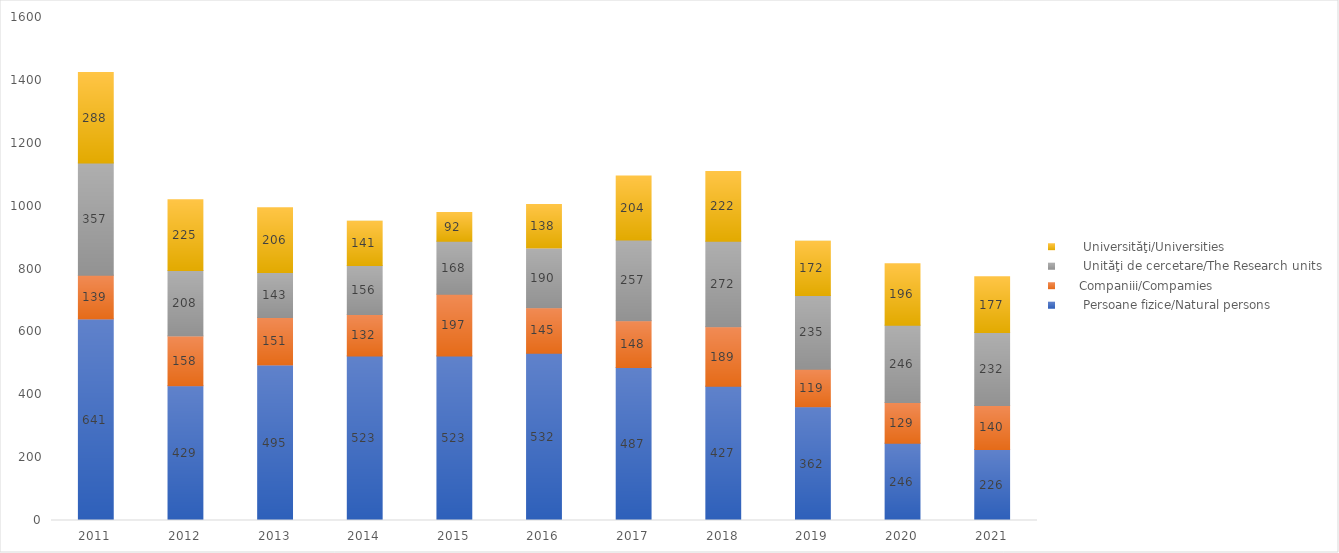
| Category |       Persoane fizice/Natural persons |      Companiii/Compamies |       Unităţi de cercetare/The Research units |       Universităţi/Universities |
|---|---|---|---|---|
| 2011.0 | 641 | 139 | 357 | 288 |
| 2012.0 | 429 | 158 | 208 | 225 |
| 2013.0 | 495 | 151 | 143 | 206 |
| 2014.0 | 523 | 132 | 156 | 141 |
| 2015.0 | 523 | 197 | 168 | 92 |
| 2016.0 | 532 | 145 | 190 | 138 |
| 2017.0 | 487 | 148 | 257 | 204 |
| 2018.0 | 427 | 189 | 272 | 222 |
| 2019.0 | 362 | 119 | 235 | 172 |
| 2020.0 | 246 | 129 | 246 | 196 |
| 2021.0 | 226 | 140 | 232 | 177 |